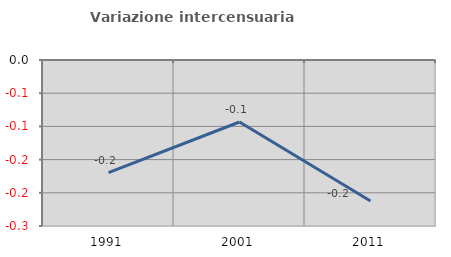
| Category | Variazione intercensuaria annua |
|---|---|
| 1991.0 | -0.17 |
| 2001.0 | -0.093 |
| 2011.0 | -0.212 |